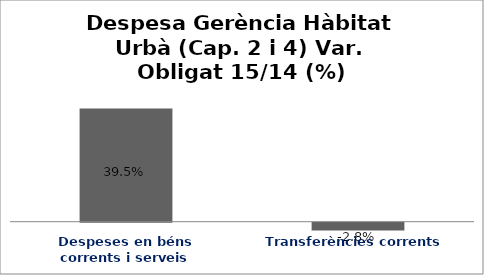
| Category | Series 0 |
|---|---|
| Despeses en béns corrents i serveis | 0.395 |
| Transferències corrents | -0.028 |